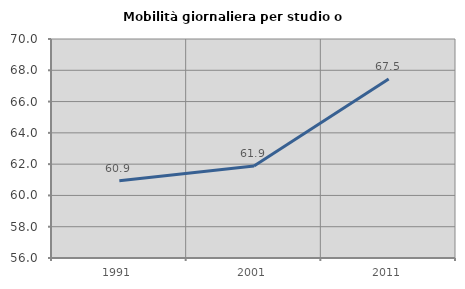
| Category | Mobilità giornaliera per studio o lavoro |
|---|---|
| 1991.0 | 60.945 |
| 2001.0 | 61.884 |
| 2011.0 | 67.45 |